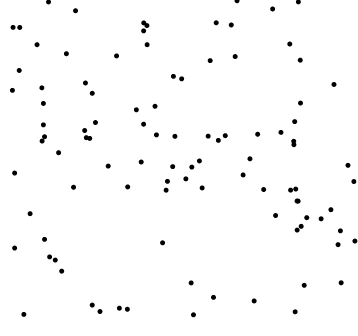
| Category | Series 0 |
|---|---|
| 0.396624962456242 | 0.612 |
| 0.406039232817654 | 0.92 |
| 0.720650536442549 | 0.58 |
| 0.115186486308297 | 0.573 |
| 0.351433216919104 | 0.416 |
| 0.126531406115419 | 0.994 |
| 0.50478031399728 | 0.754 |
| 0.0302863610788859 | 0.459 |
| 0.203215698206991 | 0.966 |
| 0.533542317523942 | 0.478 |
| 0.250716132774249 | 0.708 |
| 0.844290083984444 | 0.293 |
| 0.656706525275 | 0.823 |
| 0.835647447348809 | 0.371 |
| 0.10759745676716 | 0.726 |
| 0.993970252817763 | 0.433 |
| 0.555207792248744 | 0.497 |
| 0.771550553189667 | 0.327 |
| 0.842339973551575 | 0.678 |
| 0.296007691965786 | 0.481 |
| 0.406598943402691 | 0.86 |
| 0.0257598911403382 | 0.914 |
| 0.852884807098895 | 0.108 |
| 0.319791589047707 | 0.825 |
| 0.538279967075541 | 0.016 |
| 0.957868643042281 | 0.116 |
| 0.737738093749025 | 0.408 |
| 0.177300252144973 | 0.832 |
| 0.562929584145474 | 0.413 |
| 0.928683031294494 | 0.345 |
| 0.0432567358842832 | 0.78 |
| 0.350536262290436 | 0.034 |
| 0.397103989158873 | 0.928 |
| 0.259860110207243 | 0.617 |
| 0.433148034967483 | 0.578 |
| 0.0741701936792355 | 0.332 |
| 0.163896369818869 | 0.153 |
| 0.485578914634174 | 0.574 |
| 0.272690790386272 | 0.026 |
| 0.841590473478215 | 0.812 |
| 0.90096796665744 | 0.316 |
| 0.47928533166196 | 0.479 |
| 0.828768636845853 | 0.409 |
| 0.516652015587549 | 0.441 |
| 0.23142492789265 | 0.741 |
| 0.396700807737334 | 0.904 |
| 0.450508560788843 | 0.241 |
| 0.243549309430856 | 0.567 |
| 0.115175740763169 | 0.252 |
| 0.0239396779909216 | 0.718 |
| 0.823053874859249 | 0.558 |
| 0.0938501770260167 | 0.86 |
| 0.823689204735353 | 0.548 |
| 0.827136719916113 | 0.026 |
| 0.786863488609631 | 0.586 |
| 0.977207635694649 | 0.483 |
| 0.111956537906451 | 0.61 |
| 0.48132655303338 | 0.761 |
| 0.129620678245364 | 0.197 |
| 0.955713841172138 | 0.279 |
| 0.460595755414993 | 0.406 |
| 0.679374474871671 | 0.453 |
| 0.250649525205024 | 0.047 |
| 0.662047102828846 | 0.998 |
| 0.86007161275856 | 0.32 |
| 0.832777420206135 | 0.281 |
| 0.389850943178122 | 0.494 |
| 0.608939483201357 | 0.561 |
| 0.937452505693364 | 0.736 |
| 0.229197240132727 | 0.592 |
| 0.645637773242114 | 0.922 |
| 0.155138600474232 | 0.523 |
| 0.0447823551678275 | 0.914 |
| 0.145675755274951 | 0.187 |
| 0.0563531395895482 | 0.017 |
| 0.698728129483221 | 0.504 |
| 0.710696751677207 | 0.06 |
| 0.108229289673334 | 0.559 |
| 0.814200373895981 | 0.406 |
| 0.464315714092612 | 0.433 |
| 0.628633390850757 | 0.576 |
| 0.595219685095238 | 0.071 |
| 0.949051308522913 | 0.235 |
| 0.0302504907372346 | 0.225 |
| 0.327823103185326 | 0.037 |
| 0.585747111039798 | 0.811 |
| 0.197583747975794 | 0.415 |
| 0.825933464857384 | 0.62 |
| 0.76315191116486 | 0.972 |
| 0.531709649417668 | 0.116 |
| 0.233823160135458 | 0.57 |
| 0.602885252139962 | 0.929 |
| 0.832519753074536 | 0.372 |
| 0.579993627241595 | 0.574 |
| 0.836296986736061 | 0.994 |
| 0.111936284066973 | 0.677 |
| 0.811848650130543 | 0.862 |
| 0.376043990090712 | 0.657 |
| 0.996961924476436 | 0.247 |
| 0.429074885819244 | 0.668 |